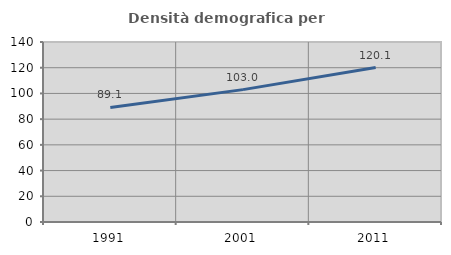
| Category | Densità demografica |
|---|---|
| 1991.0 | 89.096 |
| 2001.0 | 102.952 |
| 2011.0 | 120.12 |